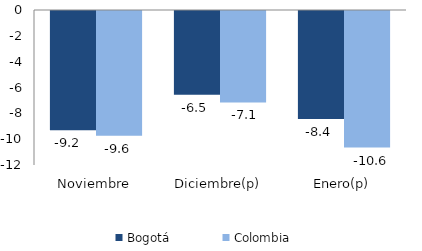
| Category | Bogotá | Colombia |
|---|---|---|
| Noviembre | -9.223 | -9.649 |
| Diciembre(p) | -6.475 | -7.075 |
| Enero(p) | -8.366 | -10.576 |